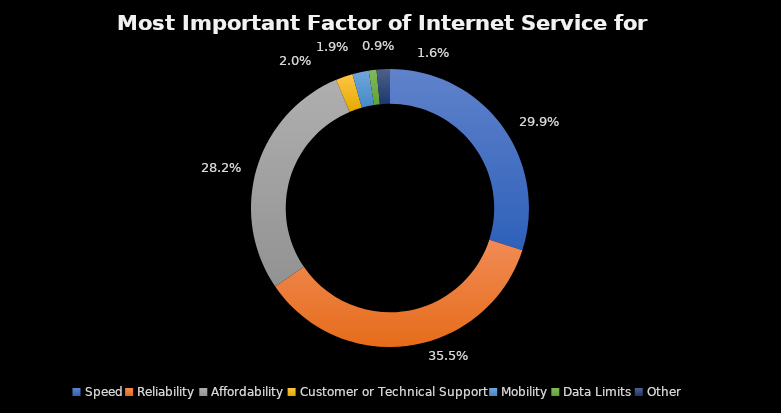
| Category | Series 0 |
|---|---|
| Speed | 0.299 |
| Reliability | 0.355 |
| Affordability | 0.282 |
| Customer or Technical Support | 0.02 |
| Mobility | 0.019 |
| Data Limits | 0.009 |
| Other | 0.016 |